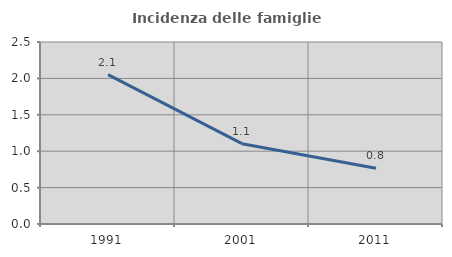
| Category | Incidenza delle famiglie numerose |
|---|---|
| 1991.0 | 2.051 |
| 2001.0 | 1.103 |
| 2011.0 | 0.766 |